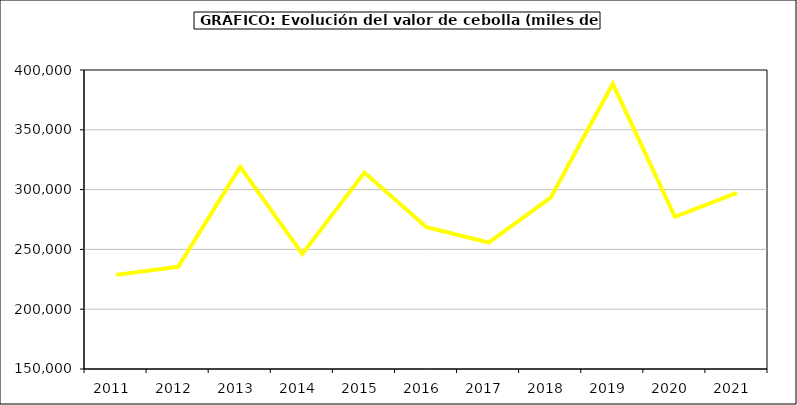
| Category | Valor |
|---|---|
| 2011.0 | 228687.172 |
| 2012.0 | 235464.837 |
| 2013.0 | 318927.963 |
| 2014.0 | 246223.118 |
| 2015.0 | 314225 |
| 2016.0 | 268515 |
| 2017.0 | 255748.291 |
| 2018.0 | 293282.611 |
| 2019.0 | 388505.94 |
| 2020.0 | 277230.916 |
| 2021.0 | 297223.368 |